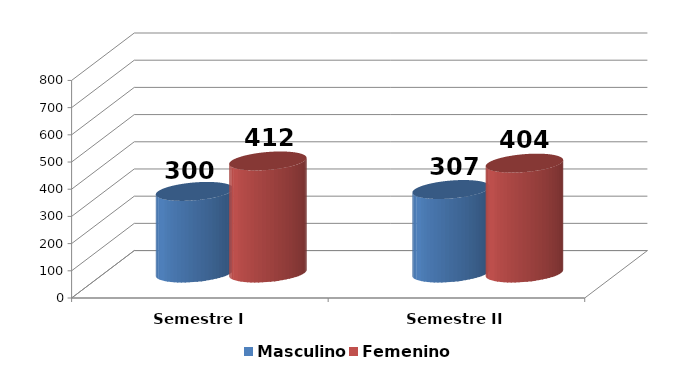
| Category | Masculino | Femenino |
|---|---|---|
| Semestre I | 300 | 412 |
| Semestre II | 307 | 404 |